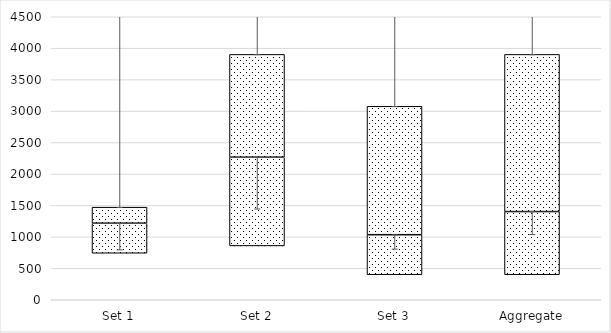
| Category | Q1 | Median-Q1 | Q3-Median |
|---|---|---|---|
| Set 1 | 739.29 | 478.157 | 254.535 |
| Set 2 | 856.258 | 1411 | 1634.071 |
| Set 3 | 397.837 | 636.603 | 2041.878 |
| Aggregate | 397.837 | 1004.566 | 2498.927 |